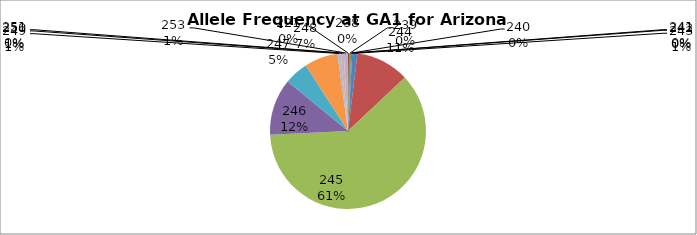
| Category | Series 0 |
|---|---|
| 221.0 | 0 |
| 238.0 | 0.002 |
| 239.0 | 0.004 |
| 240.0 | 0 |
| 241.0 | 0.002 |
| 242.0 | 0 |
| 243.0 | 0.011 |
| 244.0 | 0.11 |
| 245.0 | 0.613 |
| 246.0 | 0.117 |
| 247.0 | 0.05 |
| 248.0 | 0.069 |
| 249.0 | 0.006 |
| 250.0 | 0.006 |
| 251.0 | 0 |
| 253.0 | 0.009 |